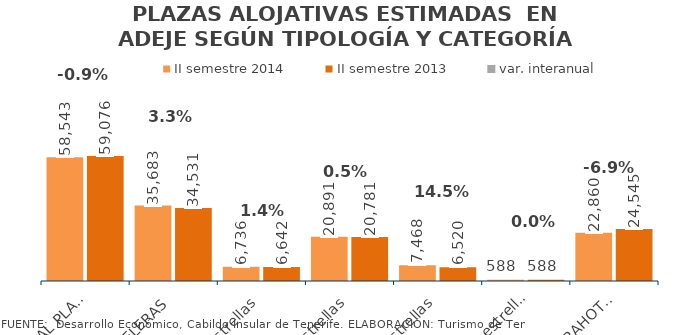
| Category | II semestre 2014 | II semestre 2013 |
|---|---|---|
| TOTAL PLAZAS | 58543 | 59076 |
| HOTELERAS | 35683 | 34531 |
| 5 estrellas | 6736 | 6642 |
| 4 estrellas | 20891 | 20781 |
| 3 estrellas | 7468 | 6520 |
| 1 Y 2 estrellas | 588 | 588 |
| EXTRAHOTELERAS | 22860 | 24545 |